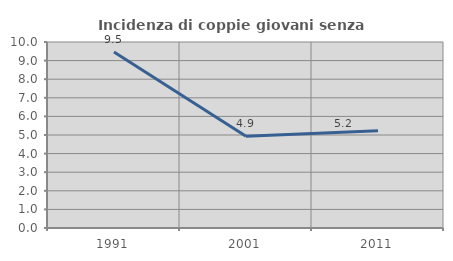
| Category | Incidenza di coppie giovani senza figli |
|---|---|
| 1991.0 | 9.459 |
| 2001.0 | 4.93 |
| 2011.0 | 5.229 |